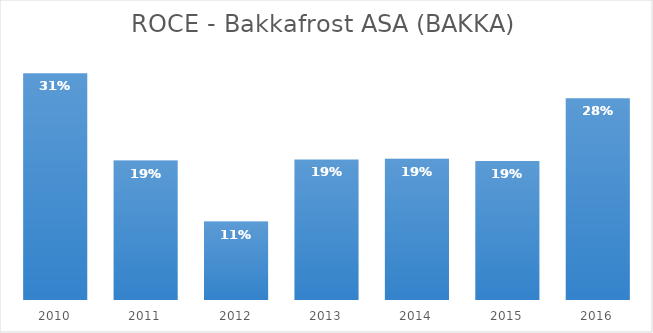
| Category | Series 0 |
|---|---|
| 2010.0 | 0.312 |
| 2011.0 | 0.192 |
| 2012.0 | 0.108 |
| 2013.0 | 0.194 |
| 2014.0 | 0.195 |
| 2015.0 | 0.191 |
| 2016.0 | 0.278 |